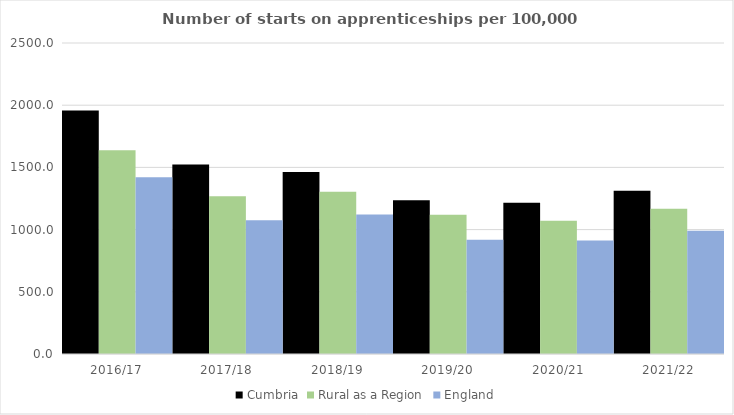
| Category | Cumbria | Rural as a Region | England |
|---|---|---|---|
| 2016/17 | 1957.394 | 1638.789 | 1420 |
| 2017/18 | 1523.399 | 1267.474 | 1075 |
| 2018/19 | 1462.08 | 1304.57 | 1122 |
| 2019/20 | 1235.792 | 1119.662 | 918 |
| 2020/21 | 1215.777 | 1070.748 | 912 |
| 2021/22 | 1311.524 | 1167.68 | 991 |